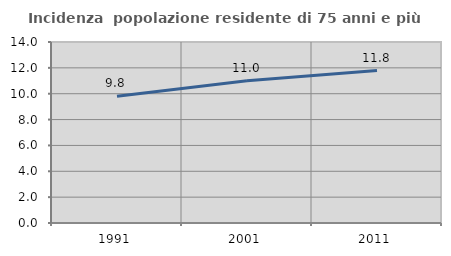
| Category | Incidenza  popolazione residente di 75 anni e più |
|---|---|
| 1991.0 | 9.802 |
| 2001.0 | 11.007 |
| 2011.0 | 11.788 |